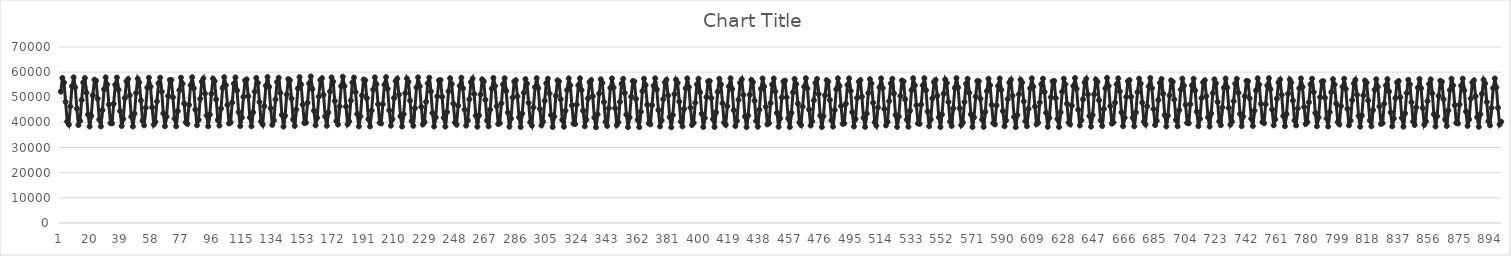
| Category | Series 0 |
|---|---|
| 0 | 52234 |
| 1 | 57701 |
| 2 | 55841 |
| 3 | 48163 |
| 4 | 40334 |
| 5 | 39147 |
| 6 | 46397 |
| 7 | 54393 |
| 8 | 57941 |
| 9 | 53971 |
| 10 | 45535 |
| 11 | 38959 |
| 12 | 40593 |
| 13 | 48872 |
| 14 | 55890 |
| 15 | 57668 |
| 16 | 51807 |
| 17 | 43085 |
| 18 | 38389 |
| 19 | 42583 |
| 20 | 50793 |
| 21 | 57032 |
| 22 | 56565 |
| 23 | 49448 |
| 24 | 41128 |
| 25 | 38424 |
| 26 | 44867 |
| 27 | 53216 |
| 28 | 57921 |
| 29 | 55079 |
| 30 | 47074 |
| 31 | 39689 |
| 32 | 39629 |
| 33 | 47374 |
| 34 | 54986 |
| 35 | 57855 |
| 36 | 53031 |
| 37 | 44496 |
| 38 | 38573 |
| 39 | 41392 |
| 40 | 49687 |
| 41 | 56341 |
| 42 | 57227 |
| 43 | 50820 |
| 44 | 42280 |
| 45 | 38414 |
| 46 | 43507 |
| 47 | 51707 |
| 48 | 57392 |
| 49 | 55973 |
| 50 | 48722 |
| 51 | 40630 |
| 52 | 38834 |
| 53 | 45824 |
| 54 | 53880 |
| 55 | 57795 |
| 56 | 54251 |
| 57 | 45980 |
| 58 | 39123 |
| 59 | 40204 |
| 60 | 48373 |
| 61 | 55586 |
| 62 | 57801 |
| 63 | 52225 |
| 64 | 43584 |
| 65 | 38486 |
| 66 | 42291 |
| 67 | 50554 |
| 68 | 56883 |
| 69 | 56895 |
| 70 | 49990 |
| 71 | 41559 |
| 72 | 38456 |
| 73 | 44497 |
| 74 | 52842 |
| 75 | 57816 |
| 76 | 55420 |
| 77 | 47576 |
| 78 | 40070 |
| 79 | 39430 |
| 80 | 46948 |
| 81 | 54782 |
| 82 | 58001 |
| 83 | 53616 |
| 84 | 45087 |
| 85 | 38851 |
| 86 | 41045 |
| 87 | 49371 |
| 88 | 56224 |
| 89 | 57502 |
| 90 | 51426 |
| 91 | 42743 |
| 92 | 38466 |
| 93 | 43120 |
| 94 | 51403 |
| 95 | 57417 |
| 96 | 56475 |
| 97 | 49116 |
| 98 | 40957 |
| 99 | 38728 |
| 100 | 45519 |
| 101 | 53721 |
| 102 | 58009 |
| 103 | 54814 |
| 104 | 46932 |
| 105 | 39601 |
| 106 | 39968 |
| 107 | 47946 |
| 108 | 55380 |
| 109 | 57916 |
| 110 | 52731 |
| 111 | 44104 |
| 112 | 38559 |
| 113 | 41880 |
| 114 | 50179 |
| 115 | 56696 |
| 116 | 57132 |
| 117 | 50439 |
| 118 | 41920 |
| 119 | 38447 |
| 120 | 44034 |
| 121 | 52252 |
| 122 | 57726 |
| 123 | 55722 |
| 124 | 48105 |
| 125 | 40365 |
| 126 | 39151 |
| 127 | 46489 |
| 128 | 54579 |
| 129 | 58103 |
| 130 | 54113 |
| 131 | 45666 |
| 132 | 39029 |
| 133 | 40806 |
| 134 | 49117 |
| 135 | 56095 |
| 136 | 57786 |
| 137 | 51740 |
| 138 | 42985 |
| 139 | 38337 |
| 140 | 42671 |
| 141 | 51041 |
| 142 | 57230 |
| 143 | 56771 |
| 144 | 49482 |
| 145 | 41182 |
| 146 | 38589 |
| 147 | 45155 |
| 148 | 53522 |
| 149 | 58047 |
| 150 | 55087 |
| 151 | 47050 |
| 152 | 39774 |
| 153 | 39887 |
| 154 | 47835 |
| 155 | 55516 |
| 156 | 58306 |
| 157 | 53298 |
| 158 | 44652 |
| 159 | 38816 |
| 160 | 41813 |
| 161 | 50267 |
| 162 | 56883 |
| 163 | 57590 |
| 164 | 51007 |
| 165 | 42382 |
| 166 | 38651 |
| 167 | 43952 |
| 168 | 52246 |
| 169 | 57912 |
| 170 | 56236 |
| 171 | 48550 |
| 172 | 40613 |
| 173 | 39141 |
| 174 | 46366 |
| 175 | 54458 |
| 176 | 58199 |
| 177 | 54419 |
| 178 | 46298 |
| 179 | 39254 |
| 180 | 40417 |
| 181 | 48694 |
| 182 | 55888 |
| 183 | 57862 |
| 184 | 52049 |
| 185 | 43338 |
| 186 | 38405 |
| 187 | 42412 |
| 188 | 50762 |
| 189 | 57046 |
| 190 | 56770 |
| 191 | 49676 |
| 192 | 41292 |
| 193 | 38407 |
| 194 | 44711 |
| 195 | 53059 |
| 196 | 57923 |
| 197 | 55208 |
| 198 | 47281 |
| 199 | 39852 |
| 200 | 39553 |
| 201 | 47277 |
| 202 | 55076 |
| 203 | 58033 |
| 204 | 53397 |
| 205 | 44802 |
| 206 | 38697 |
| 207 | 41251 |
| 208 | 49714 |
| 209 | 56434 |
| 210 | 57432 |
| 211 | 51047 |
| 212 | 42404 |
| 213 | 38369 |
| 214 | 43299 |
| 215 | 51615 |
| 216 | 57466 |
| 217 | 56149 |
| 218 | 48629 |
| 219 | 40559 |
| 220 | 38646 |
| 221 | 45681 |
| 222 | 53906 |
| 223 | 57926 |
| 224 | 54395 |
| 225 | 46157 |
| 226 | 39224 |
| 227 | 40071 |
| 228 | 48207 |
| 229 | 55556 |
| 230 | 57799 |
| 231 | 52294 |
| 232 | 43713 |
| 233 | 38386 |
| 234 | 42002 |
| 235 | 50362 |
| 236 | 56711 |
| 237 | 56853 |
| 238 | 50162 |
| 239 | 41859 |
| 240 | 38350 |
| 241 | 44142 |
| 242 | 52339 |
| 243 | 57577 |
| 244 | 55302 |
| 245 | 47514 |
| 246 | 39924 |
| 247 | 39119 |
| 248 | 46624 |
| 249 | 54532 |
| 250 | 57787 |
| 251 | 53578 |
| 252 | 45090 |
| 253 | 38720 |
| 254 | 40758 |
| 255 | 49172 |
| 256 | 56023 |
| 257 | 57440 |
| 258 | 51295 |
| 259 | 42656 |
| 260 | 38281 |
| 261 | 42795 |
| 262 | 51078 |
| 263 | 57107 |
| 264 | 56289 |
| 265 | 48946 |
| 266 | 40763 |
| 267 | 38416 |
| 268 | 45093 |
| 269 | 53400 |
| 270 | 57691 |
| 271 | 54491 |
| 272 | 46439 |
| 273 | 39343 |
| 274 | 39661 |
| 275 | 47594 |
| 276 | 55104 |
| 277 | 57580 |
| 278 | 52463 |
| 279 | 43936 |
| 280 | 38301 |
| 281 | 41483 |
| 282 | 49842 |
| 283 | 56270 |
| 284 | 56787 |
| 285 | 50372 |
| 286 | 42014 |
| 287 | 38179 |
| 288 | 43558 |
| 289 | 51770 |
| 290 | 57239 |
| 291 | 55403 |
| 292 | 47786 |
| 293 | 40053 |
| 294 | 38770 |
| 295 | 46029 |
| 296 | 54031 |
| 297 | 57594 |
| 298 | 53685 |
| 299 | 45352 |
| 300 | 38767 |
| 301 | 40267 |
| 302 | 48580 |
| 303 | 55596 |
| 304 | 57387 |
| 305 | 51505 |
| 306 | 42900 |
| 307 | 38175 |
| 308 | 42327 |
| 309 | 50605 |
| 310 | 56740 |
| 311 | 56312 |
| 312 | 49201 |
| 313 | 40968 |
| 314 | 38275 |
| 315 | 44639 |
| 316 | 52911 |
| 317 | 57537 |
| 318 | 54746 |
| 319 | 46790 |
| 320 | 39504 |
| 321 | 39364 |
| 322 | 47127 |
| 323 | 54772 |
| 324 | 57546 |
| 325 | 52886 |
| 326 | 44628 |
| 327 | 38426 |
| 328 | 41096 |
| 329 | 49501 |
| 330 | 56015 |
| 331 | 56850 |
| 332 | 50426 |
| 333 | 41917 |
| 334 | 38077 |
| 335 | 43198 |
| 336 | 51432 |
| 337 | 57164 |
| 338 | 55680 |
| 339 | 48109 |
| 340 | 40205 |
| 341 | 38590 |
| 342 | 45674 |
| 343 | 53732 |
| 344 | 57528 |
| 345 | 53893 |
| 346 | 45654 |
| 347 | 38933 |
| 348 | 40050 |
| 349 | 48180 |
| 350 | 55350 |
| 351 | 57360 |
| 352 | 51674 |
| 353 | 43106 |
| 354 | 38121 |
| 355 | 41948 |
| 356 | 50226 |
| 357 | 56449 |
| 358 | 56298 |
| 359 | 49342 |
| 360 | 41064 |
| 361 | 38129 |
| 362 | 44235 |
| 363 | 52458 |
| 364 | 57422 |
| 365 | 54837 |
| 366 | 47052 |
| 367 | 39647 |
| 368 | 39216 |
| 369 | 46845 |
| 370 | 54589 |
| 371 | 57562 |
| 372 | 53124 |
| 373 | 44902 |
| 374 | 38434 |
| 375 | 40821 |
| 376 | 49201 |
| 377 | 55873 |
| 378 | 56952 |
| 379 | 50645 |
| 380 | 42102 |
| 381 | 38083 |
| 382 | 42954 |
| 383 | 51207 |
| 384 | 56983 |
| 385 | 55746 |
| 386 | 48302 |
| 387 | 40302 |
| 388 | 38396 |
| 389 | 45382 |
| 390 | 53554 |
| 391 | 57524 |
| 392 | 54083 |
| 393 | 45894 |
| 394 | 39024 |
| 395 | 39777 |
| 396 | 47861 |
| 397 | 55177 |
| 398 | 57402 |
| 399 | 51963 |
| 400 | 43438 |
| 401 | 38156 |
| 402 | 41751 |
| 403 | 50083 |
| 404 | 56374 |
| 405 | 56488 |
| 406 | 49652 |
| 407 | 41328 |
| 408 | 38158 |
| 409 | 44013 |
| 410 | 52180 |
| 411 | 57381 |
| 412 | 55102 |
| 413 | 47617 |
| 414 | 39888 |
| 415 | 39021 |
| 416 | 46479 |
| 417 | 54338 |
| 418 | 57554 |
| 419 | 53278 |
| 420 | 44856 |
| 421 | 38551 |
| 422 | 40631 |
| 423 | 48992 |
| 424 | 55780 |
| 425 | 57151 |
| 426 | 50955 |
| 427 | 42388 |
| 428 | 38107 |
| 429 | 42730 |
| 430 | 50992 |
| 431 | 56893 |
| 432 | 56000 |
| 433 | 48650 |
| 434 | 40563 |
| 435 | 38298 |
| 436 | 45083 |
| 437 | 53340 |
| 438 | 57510 |
| 439 | 54280 |
| 440 | 46229 |
| 441 | 39218 |
| 442 | 39705 |
| 443 | 47654 |
| 444 | 55064 |
| 445 | 57488 |
| 446 | 52286 |
| 447 | 43773 |
| 448 | 38270 |
| 449 | 41591 |
| 450 | 49942 |
| 451 | 56274 |
| 452 | 56624 |
| 453 | 49950 |
| 454 | 41542 |
| 455 | 38164 |
| 456 | 43750 |
| 457 | 51952 |
| 458 | 57296 |
| 459 | 55260 |
| 460 | 47552 |
| 461 | 39957 |
| 462 | 38928 |
| 463 | 46283 |
| 464 | 54216 |
| 465 | 57603 |
| 466 | 53532 |
| 467 | 45140 |
| 468 | 38735 |
| 469 | 40467 |
| 470 | 48811 |
| 471 | 55729 |
| 472 | 57298 |
| 473 | 51288 |
| 474 | 42658 |
| 475 | 38165 |
| 476 | 42510 |
| 477 | 50790 |
| 478 | 56801 |
| 479 | 56182 |
| 480 | 48926 |
| 481 | 40814 |
| 482 | 38330 |
| 483 | 44891 |
| 484 | 53198 |
| 485 | 57561 |
| 486 | 54556 |
| 487 | 46528 |
| 488 | 39442 |
| 489 | 39577 |
| 490 | 47446 |
| 491 | 54933 |
| 492 | 57540 |
| 493 | 52560 |
| 494 | 44055 |
| 495 | 38377 |
| 496 | 41342 |
| 497 | 49708 |
| 498 | 56181 |
| 499 | 56831 |
| 500 | 50268 |
| 501 | 41817 |
| 502 | 38210 |
| 503 | 43527 |
| 504 | 51715 |
| 505 | 57216 |
| 506 | 55521 |
| 507 | 47799 |
| 508 | 40091 |
| 509 | 38728 |
| 510 | 45945 |
| 511 | 53955 |
| 512 | 57523 |
| 513 | 53695 |
| 514 | 45342 |
| 515 | 38786 |
| 516 | 40218 |
| 517 | 48469 |
| 518 | 55517 |
| 519 | 57366 |
| 520 | 51515 |
| 521 | 42958 |
| 522 | 38204 |
| 523 | 42301 |
| 524 | 50560 |
| 525 | 56673 |
| 526 | 56304 |
| 527 | 49187 |
| 528 | 41062 |
| 529 | 38294 |
| 530 | 44619 |
| 531 | 52877 |
| 532 | 57568 |
| 533 | 54762 |
| 534 | 46809 |
| 535 | 39598 |
| 536 | 39417 |
| 537 | 47102 |
| 538 | 54760 |
| 539 | 57583 |
| 540 | 52809 |
| 541 | 44343 |
| 542 | 38481 |
| 543 | 41186 |
| 544 | 49549 |
| 545 | 56069 |
| 546 | 56935 |
| 547 | 50592 |
| 548 | 42056 |
| 549 | 38190 |
| 550 | 43197 |
| 551 | 51399 |
| 552 | 57085 |
| 553 | 55687 |
| 554 | 48116 |
| 555 | 40276 |
| 556 | 38575 |
| 557 | 45645 |
| 558 | 53714 |
| 559 | 57635 |
| 560 | 53924 |
| 561 | 45652 |
| 562 | 38921 |
| 563 | 39973 |
| 564 | 48134 |
| 565 | 55343 |
| 566 | 57376 |
| 567 | 51759 |
| 568 | 43229 |
| 569 | 38177 |
| 570 | 42025 |
| 571 | 50287 |
| 572 | 56466 |
| 573 | 56365 |
| 574 | 49412 |
| 575 | 41179 |
| 576 | 38224 |
| 577 | 44250 |
| 578 | 52454 |
| 579 | 57399 |
| 580 | 54838 |
| 581 | 46991 |
| 582 | 39672 |
| 583 | 39215 |
| 584 | 46767 |
| 585 | 54544 |
| 586 | 57507 |
| 587 | 52960 |
| 588 | 44533 |
| 589 | 38449 |
| 590 | 40851 |
| 591 | 49237 |
| 592 | 55887 |
| 593 | 56995 |
| 594 | 50669 |
| 595 | 42165 |
| 596 | 38114 |
| 597 | 42958 |
| 598 | 51215 |
| 599 | 56993 |
| 600 | 55820 |
| 601 | 48387 |
| 602 | 40433 |
| 603 | 38501 |
| 604 | 45416 |
| 605 | 53572 |
| 606 | 57544 |
| 607 | 54194 |
| 608 | 46341 |
| 609 | 39247 |
| 610 | 39890 |
| 611 | 47929 |
| 612 | 55195 |
| 613 | 57408 |
| 614 | 52079 |
| 615 | 43791 |
| 616 | 38247 |
| 617 | 41776 |
| 618 | 50061 |
| 619 | 56336 |
| 620 | 56484 |
| 621 | 49631 |
| 622 | 41333 |
| 623 | 38182 |
| 624 | 44036 |
| 625 | 52203 |
| 626 | 57416 |
| 627 | 55135 |
| 628 | 47413 |
| 629 | 39950 |
| 630 | 39205 |
| 631 | 46645 |
| 632 | 54478 |
| 633 | 57656 |
| 634 | 53379 |
| 635 | 45018 |
| 636 | 38765 |
| 637 | 40846 |
| 638 | 49179 |
| 639 | 55929 |
| 640 | 57310 |
| 641 | 51110 |
| 642 | 42552 |
| 643 | 38320 |
| 644 | 42936 |
| 645 | 51155 |
| 646 | 57061 |
| 647 | 56136 |
| 648 | 48826 |
| 649 | 40820 |
| 650 | 38576 |
| 651 | 45348 |
| 652 | 53567 |
| 653 | 57703 |
| 654 | 54500 |
| 655 | 46451 |
| 656 | 39504 |
| 657 | 39968 |
| 658 | 47843 |
| 659 | 55182 |
| 660 | 57544 |
| 661 | 52397 |
| 662 | 44001 |
| 663 | 38518 |
| 664 | 41835 |
| 665 | 50150 |
| 666 | 56424 |
| 667 | 56845 |
| 668 | 50188 |
| 669 | 41828 |
| 670 | 38447 |
| 671 | 44007 |
| 672 | 52110 |
| 673 | 57429 |
| 674 | 55456 |
| 675 | 47889 |
| 676 | 40243 |
| 677 | 39173 |
| 678 | 46436 |
| 679 | 54295 |
| 680 | 57658 |
| 681 | 53661 |
| 682 | 45340 |
| 683 | 38959 |
| 684 | 40651 |
| 685 | 48899 |
| 686 | 55738 |
| 687 | 57298 |
| 688 | 51386 |
| 689 | 42923 |
| 690 | 38395 |
| 691 | 42642 |
| 692 | 50774 |
| 693 | 56725 |
| 694 | 56154 |
| 695 | 49066 |
| 696 | 40984 |
| 697 | 38444 |
| 698 | 44902 |
| 699 | 53072 |
| 700 | 57455 |
| 701 | 54596 |
| 702 | 47031 |
| 703 | 39779 |
| 704 | 39608 |
| 705 | 47270 |
| 706 | 54749 |
| 707 | 57398 |
| 708 | 52666 |
| 709 | 44253 |
| 710 | 38520 |
| 711 | 41398 |
| 712 | 49650 |
| 713 | 56005 |
| 714 | 56761 |
| 715 | 50403 |
| 716 | 42058 |
| 717 | 38362 |
| 718 | 43514 |
| 719 | 51627 |
| 720 | 57146 |
| 721 | 55571 |
| 722 | 48163 |
| 723 | 40393 |
| 724 | 38879 |
| 725 | 45949 |
| 726 | 53833 |
| 727 | 57481 |
| 728 | 53833 |
| 729 | 45756 |
| 730 | 39126 |
| 731 | 40368 |
| 732 | 48432 |
| 733 | 55417 |
| 734 | 57369 |
| 735 | 51771 |
| 736 | 43382 |
| 737 | 38497 |
| 738 | 42364 |
| 739 | 50470 |
| 740 | 56544 |
| 741 | 56391 |
| 742 | 49573 |
| 743 | 41448 |
| 744 | 38574 |
| 745 | 44671 |
| 746 | 52731 |
| 747 | 57552 |
| 748 | 55057 |
| 749 | 47382 |
| 750 | 40101 |
| 751 | 39698 |
| 752 | 47209 |
| 753 | 54704 |
| 754 | 57593 |
| 755 | 53213 |
| 756 | 45149 |
| 757 | 38861 |
| 758 | 41209 |
| 759 | 49425 |
| 760 | 55930 |
| 761 | 57056 |
| 762 | 50961 |
| 763 | 42526 |
| 764 | 38509 |
| 765 | 43307 |
| 766 | 51391 |
| 767 | 57088 |
| 768 | 55880 |
| 769 | 48646 |
| 770 | 40758 |
| 771 | 38785 |
| 772 | 45591 |
| 773 | 53571 |
| 774 | 57500 |
| 775 | 54117 |
| 776 | 46147 |
| 777 | 39372 |
| 778 | 40118 |
| 779 | 48024 |
| 780 | 55132 |
| 781 | 57390 |
| 782 | 52082 |
| 783 | 43745 |
| 784 | 38487 |
| 785 | 41973 |
| 786 | 50077 |
| 787 | 56266 |
| 788 | 56416 |
| 789 | 49778 |
| 790 | 41564 |
| 791 | 38391 |
| 792 | 44089 |
| 793 | 52060 |
| 794 | 57227 |
| 795 | 55061 |
| 796 | 47513 |
| 797 | 40097 |
| 798 | 39227 |
| 799 | 46508 |
| 800 | 54178 |
| 801 | 57381 |
| 802 | 53333 |
| 803 | 45423 |
| 804 | 38825 |
| 805 | 40720 |
| 806 | 48875 |
| 807 | 55534 |
| 808 | 56920 |
| 809 | 50988 |
| 810 | 42592 |
| 811 | 38300 |
| 812 | 42716 |
| 813 | 50768 |
| 814 | 56617 |
| 815 | 55847 |
| 816 | 48719 |
| 817 | 40772 |
| 818 | 38442 |
| 819 | 44950 |
| 820 | 53021 |
| 821 | 57199 |
| 822 | 54145 |
| 823 | 46333 |
| 824 | 39373 |
| 825 | 39676 |
| 826 | 47424 |
| 827 | 54718 |
| 828 | 57236 |
| 829 | 52271 |
| 830 | 43985 |
| 831 | 38422 |
| 832 | 41518 |
| 833 | 49640 |
| 834 | 55913 |
| 835 | 56467 |
| 836 | 50027 |
| 837 | 41769 |
| 838 | 38305 |
| 839 | 43634 |
| 840 | 51619 |
| 841 | 56968 |
| 842 | 55164 |
| 843 | 47997 |
| 844 | 40398 |
| 845 | 38951 |
| 846 | 46013 |
| 847 | 53789 |
| 848 | 57305 |
| 849 | 53582 |
| 850 | 45743 |
| 851 | 39076 |
| 852 | 40430 |
| 853 | 48502 |
| 854 | 55329 |
| 855 | 57134 |
| 856 | 51512 |
| 857 | 43260 |
| 858 | 38384 |
| 859 | 42500 |
| 860 | 50559 |
| 861 | 56585 |
| 862 | 56165 |
| 863 | 49207 |
| 864 | 41146 |
| 865 | 38558 |
| 866 | 44774 |
| 867 | 52876 |
| 868 | 57405 |
| 869 | 54682 |
| 870 | 46895 |
| 871 | 39783 |
| 872 | 39570 |
| 873 | 47136 |
| 874 | 54589 |
| 875 | 57423 |
| 876 | 52720 |
| 877 | 44304 |
| 878 | 38590 |
| 879 | 41251 |
| 880 | 49456 |
| 881 | 55906 |
| 882 | 56733 |
| 883 | 50423 |
| 884 | 42038 |
| 885 | 38263 |
| 886 | 43264 |
| 887 | 51348 |
| 888 | 56986 |
| 889 | 55528 |
| 890 | 48144 |
| 891 | 40438 |
| 892 | 38826 |
| 893 | 45774 |
| 894 | 53668 |
| 895 | 57487 |
| 896 | 53904 |
| 897 | 45823 |
| 898 | 39170 |
| 899 | 40257 |